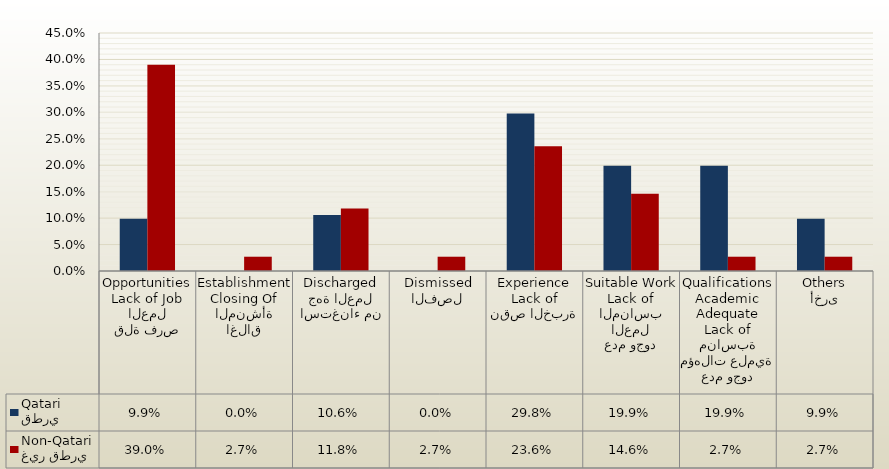
| Category | قطري
Qatari | غير قطري
Non-Qatari |
|---|---|---|
| قلة فرص العمل
Lack of Job Opportunities | 0.099 | 0.39 |
| اغلاق المنشأة
Closing Of Establishment | 0 | 0.027 |
| استغناء من جهة العمل
Discharged | 0.106 | 0.118 |
| الفصل
Dismissed | 0 | 0.027 |
| نقص الخبرة
Lack of Experience | 0.298 | 0.236 |
| عدم وجود العمل المناسب
Lack of Suitable Work | 0.199 | 0.146 |
| عدم وجود مؤهلات علمية مناسبة
Lack of Adequate Academic Qualifications | 0.199 | 0.027 |
| أخرى
Others | 0.099 | 0.027 |